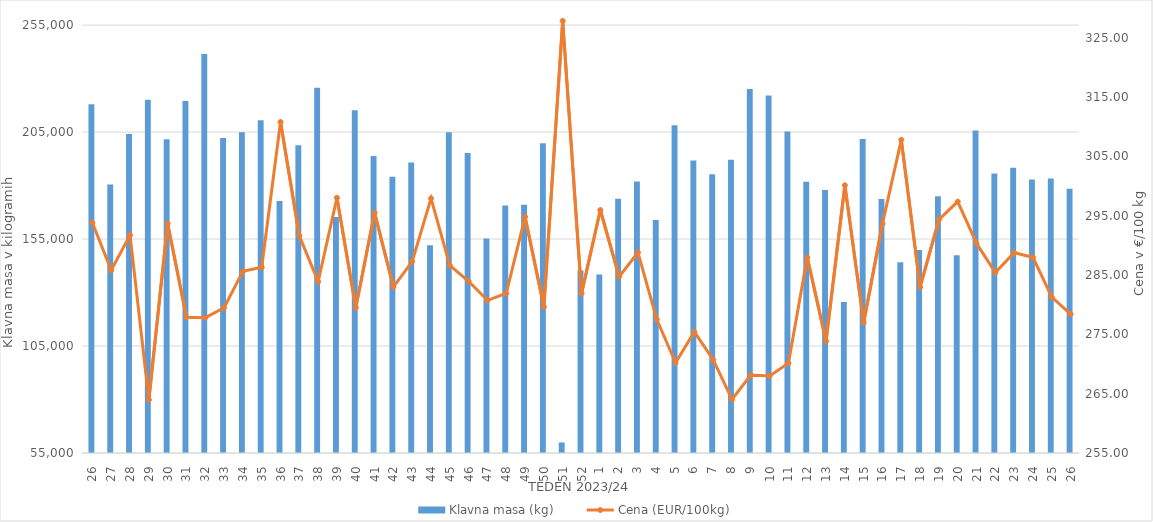
| Category | Klavna masa (kg) |
|---|---|
| 26.0 | 218064 |
| 27.0 | 180556 |
| 28.0 | 204078 |
| 29.0 | 220162 |
| 30.0 | 201649 |
| 31.0 | 219538 |
| 32.0 | 241549 |
| 33.0 | 202261 |
| 34.0 | 204903 |
| 35.0 | 210575 |
| 36.0 | 172745 |
| 37.0 | 198877 |
| 38.0 | 225730 |
| 39.0 | 165273 |
| 40.0 | 215175 |
| 41.0 | 193769 |
| 42.0 | 184122 |
| 43.0 | 190834 |
| 44.0 | 152119 |
| 45.0 | 204974 |
| 46.0 | 195179 |
| 47.0 | 155300 |
| 48.0 | 170687 |
| 49.0 | 171040 |
| 50.0 | 199802 |
| 51.0 | 59936 |
| 52.0 | 140361 |
| 1.0 | 138450 |
| 2.0 | 173833 |
| 3.0 | 181907 |
| 4.0 | 163901 |
| 5.0 | 208207 |
| 6.0 | 191770 |
| 7.0 | 185347 |
| 8.0 | 192049 |
| 9.0 | 225097 |
| 10.0 | 222116 |
| 11.0 | 205236 |
| 12.0 | 181756 |
| 13.0 | 177921 |
| 14.0 | 125545 |
| 15.0 | 201765 |
| 16.0 | 173696 |
| 17.0 | 144118 |
| 18.0 | 149874 |
| 19.0 | 174983 |
| 20.0 | 147389 |
| 21.0 | 205795 |
| 22.0 | 185604 |
| 23.0 | 188378 |
| 24.0 | 182824 |
| 25.0 | 183294 |
| 26.0 | 178550 |